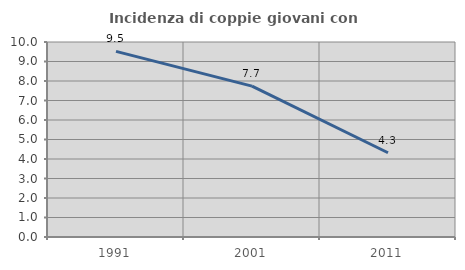
| Category | Incidenza di coppie giovani con figli |
|---|---|
| 1991.0 | 9.517 |
| 2001.0 | 7.739 |
| 2011.0 | 4.32 |